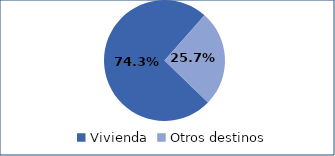
| Category | Series 0 |
|---|---|
| Vivienda | 0.743 |
| Otros destinos | 0.257 |